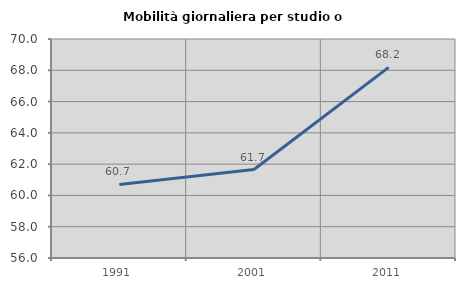
| Category | Mobilità giornaliera per studio o lavoro |
|---|---|
| 1991.0 | 60.699 |
| 2001.0 | 61.657 |
| 2011.0 | 68.185 |